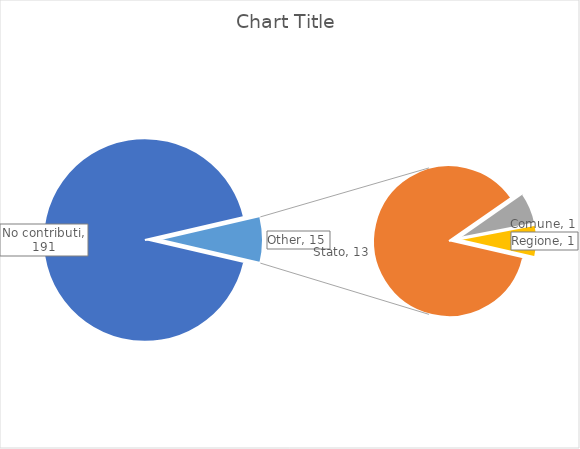
| Category | Series 0 |
|---|---|
| No contributi | 191 |
| Stato | 13 |
| Comune | 1 |
| Regione | 1 |